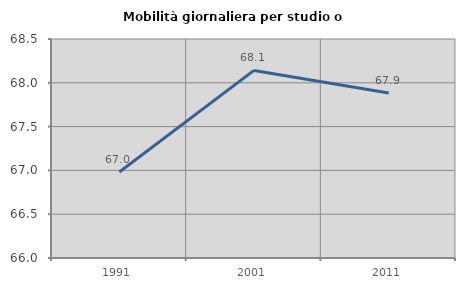
| Category | Mobilità giornaliera per studio o lavoro |
|---|---|
| 1991.0 | 66.982 |
| 2001.0 | 68.141 |
| 2011.0 | 67.884 |